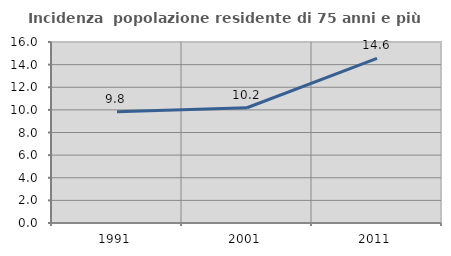
| Category | Incidenza  popolazione residente di 75 anni e più |
|---|---|
| 1991.0 | 9.836 |
| 2001.0 | 10.187 |
| 2011.0 | 14.557 |